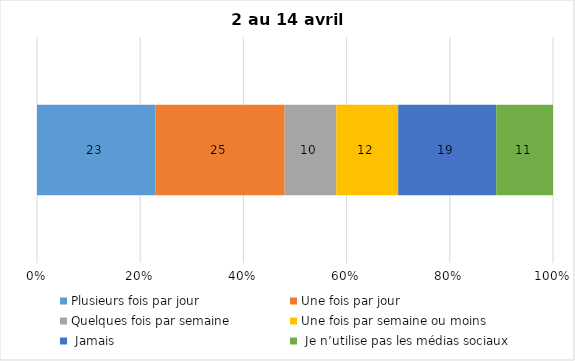
| Category | Plusieurs fois par jour | Une fois par jour | Quelques fois par semaine   | Une fois par semaine ou moins   |  Jamais   |  Je n’utilise pas les médias sociaux |
|---|---|---|---|---|---|---|
| 0 | 23 | 25 | 10 | 12 | 19 | 11 |